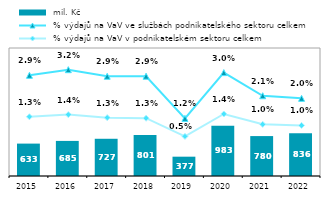
| Category |  mil. Kč |
|---|---|
| 2015.0 | 632.822 |
| 2016.0 | 685.294 |
| 2017.0 | 727.041 |
| 2018.0 | 800.583 |
| 2019.0 | 377.268 |
| 2020.0 | 982.945 |
| 2021.0 | 779.652 |
| 2022.0 | 835.665 |